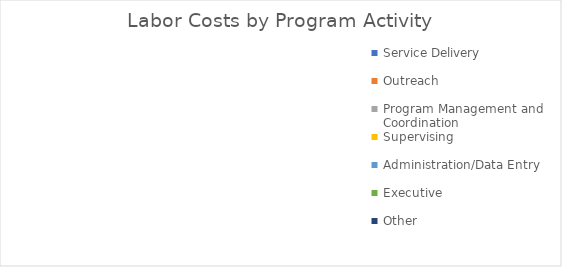
| Category | Series 0 |
|---|---|
| Service Delivery | 0 |
| Outreach | 0 |
| Program Management and Coordination | 0 |
| Supervising | 0 |
| Administration/Data Entry | 0 |
| Executive | 0 |
| Other | 0 |